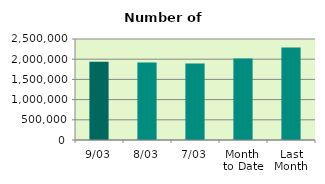
| Category | Series 0 |
|---|---|
| 9/03 | 1934300 |
| 8/03 | 1917742 |
| 7/03 | 1893248 |
| Month 
to Date | 2016282.857 |
| Last
Month | 2290810.7 |